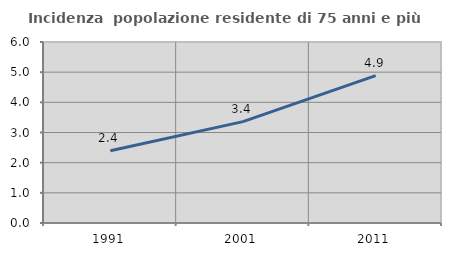
| Category | Incidenza  popolazione residente di 75 anni e più |
|---|---|
| 1991.0 | 2.398 |
| 2001.0 | 3.361 |
| 2011.0 | 4.887 |